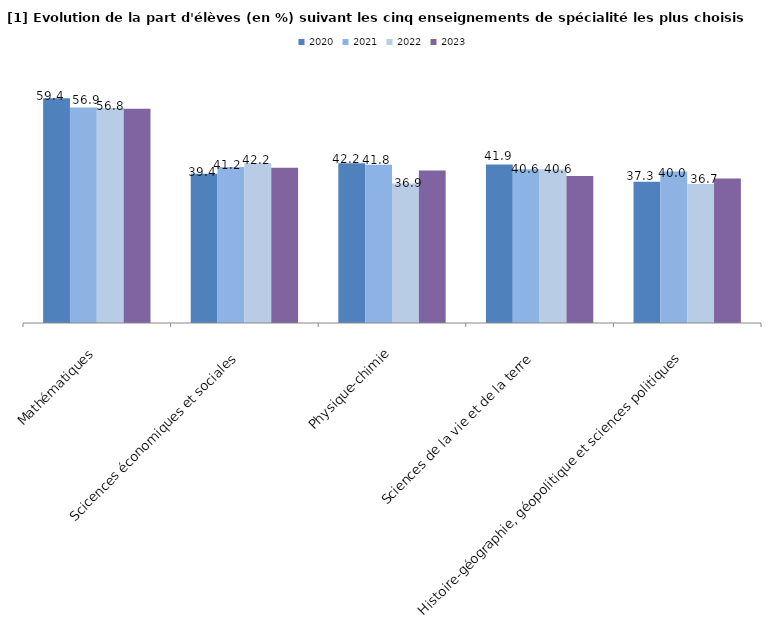
| Category | 2020 | 2021 | 2022 | 2023 |
|---|---|---|---|---|
| Mathématiques | 59.4 | 56.9 | 56.76 | 56.6 |
| Scicences économiques et sociales | 39.4 | 41.2 | 42.168 | 41 |
| Physique-chimie | 42.2 | 41.8 | 36.867 | 40.3 |
| Sciences de la vie et de la terre | 41.9 | 40.6 | 40.619 | 38.8 |
| Histoire-géographie, géopolitique et sciences politiques | 37.3 | 40 | 36.689 | 38.2 |